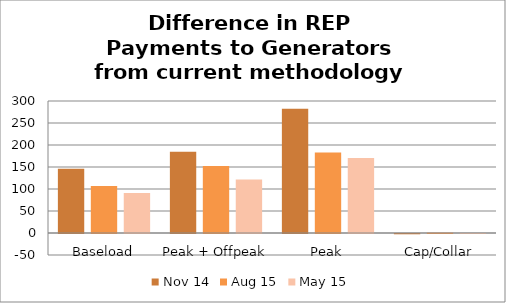
| Category | Nov 14 | Aug 15 | May 15 |
|---|---|---|---|
| Baseload | 145.823 | 106.789 | 90.859 |
| Peak + Offpeak | 184.719 | 152.252 | 121.448 |
| Peak | 282.324 | 183.03 | 170.23 |
| Cap/Collar | -0.658 | 0.769 | 0.02 |